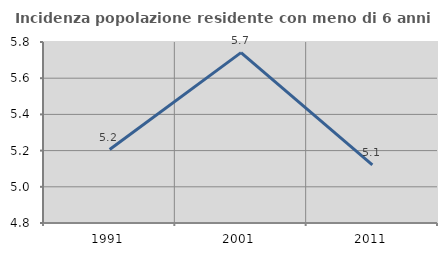
| Category | Incidenza popolazione residente con meno di 6 anni |
|---|---|
| 1991.0 | 5.206 |
| 2001.0 | 5.741 |
| 2011.0 | 5.121 |